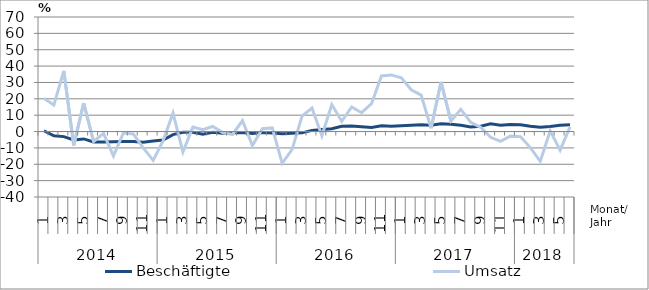
| Category | Beschäftigte | Umsatz |
|---|---|---|
| 0 | 0.5 | 20.3 |
| 1 | -2.6 | 16.2 |
| 2 | -3.1 | 37.1 |
| 3 | -5.1 | -8.5 |
| 4 | -4.5 | 17.4 |
| 5 | -6.4 | -6.1 |
| 6 | -6.4 | -1.1 |
| 7 | -6.2 | -14.9 |
| 8 | -6.1 | -0.9 |
| 9 | -6.1 | -1.5 |
| 10 | -6.6 | -10 |
| 11 | -5.8 | -17.6 |
| 12 | -5.2 | -5.7 |
| 13 | -1.9 | 11.2 |
| 14 | -0.5 | -12.5 |
| 15 | -0.5 | 2.7 |
| 16 | -1.7 | 1.2 |
| 17 | -0.5 | 3.1 |
| 18 | -1.1 | -0.6 |
| 19 | -0.8 | -1.8 |
| 20 | -0.6 | 6.7 |
| 21 | -1.2 | -8.6 |
| 22 | -0.6 | 1.7 |
| 23 | -0.9 | 2.2 |
| 24 | -1.3 | -19.4 |
| 25 | -1.1 | -10.9 |
| 26 | -0.8 | 9.4 |
| 27 | 0.7 | 14.4 |
| 28 | 1.2 | -2.6 |
| 29 | 1.7 | 16.5 |
| 30 | 3.2 | 6.3 |
| 31 | 3.4 | 15 |
| 32 | 3 | 11.5 |
| 33 | 2.5 | 17 |
| 34 | 3.6 | 34 |
| 35 | 3.2 | 34.6 |
| 36 | 3.5 | 32.8 |
| 37 | 3.8 | 25.5 |
| 38 | 4.2 | 22.3 |
| 39 | 3.9 | 2 |
| 40 | 4.7 | 30.3 |
| 41 | 4.4 | 6.4 |
| 42 | 3.9 | 13.6 |
| 43 | 2.8 | 5.6 |
| 44 | 3.3 | 2.6 |
| 45 | 4.7 | -3.5 |
| 46 | 3.8 | -6 |
| 47 | 4.3 | -2.7 |
| 48 | 4.2 | -3.1 |
| 49 | 3.3 | -9.8 |
| 50 | 2.6 | -18.2 |
| 51 | 3.1 | 0.4 |
| 52 | 3.8 | -11.4 |
| 53 | 4.1 | 2.9 |